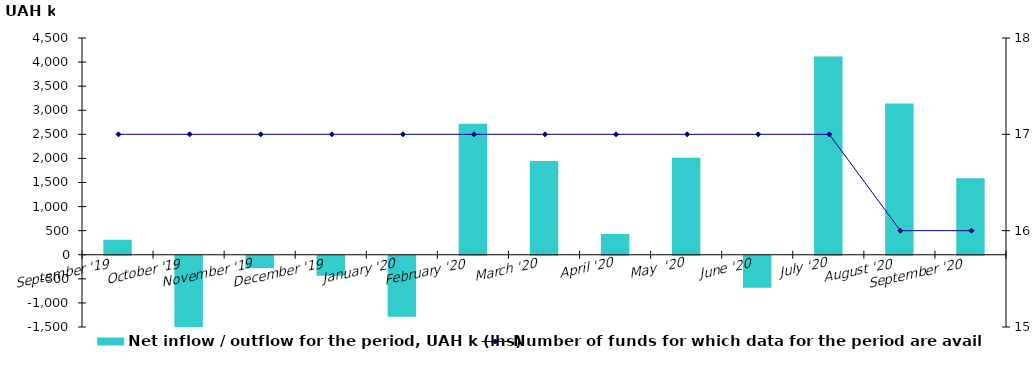
| Category | Net inflow / outflow for the period, UAH k (lhs) |
|---|---|
|    September '19 | 311.168 |
|    October '19 | -1545.724 |
|    November '19 | -255.903 |
|    December '19 | -415.371 |
| January '20 | -1268.023 |
| February '20 | 2721.965 |
| March '20 | 1946.081 |
| April '20 | 431.13 |
| May  '20 | 2014.529 |
| June '20 | -664.026 |
| July '20 | 4118.162 |
|    August '20 | 3141.082 |
|    September '20 | 1590.018 |